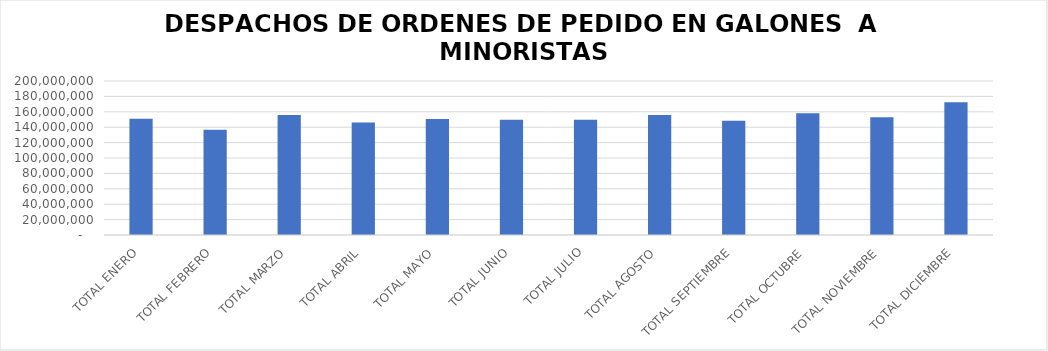
| Category | Series 0 |
|---|---|
| TOTAL ENERO | 151061854.18 |
| TOTAL FEBRERO | 136634976.87 |
| TOTAL MARZO | 155767389.98 |
| TOTAL ABRIL | 146095902.69 |
| TOTAL MAYO | 150669765.01 |
| TOTAL JUNIO | 149689683.69 |
| TOTAL JULIO | 149744990.03 |
| TOTAL AGOSTO | 155690438.58 |
| TOTAL SEPTIEMBRE | 148291642.58 |
| TOTAL OCTUBRE | 158037725.58 |
| TOTAL NOVIEMBRE | 153078025.58 |
| TOTAL DICIEMBRE | 172497573.08 |